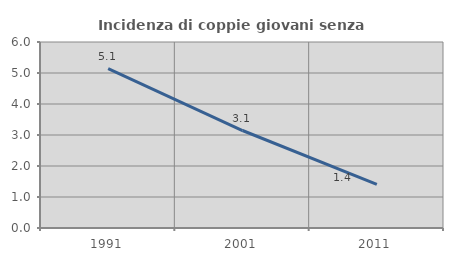
| Category | Incidenza di coppie giovani senza figli |
|---|---|
| 1991.0 | 5.145 |
| 2001.0 | 3.145 |
| 2011.0 | 1.408 |